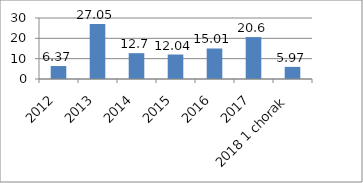
| Category | Series 0 |
|---|---|
| 2012 | 6.37 |
| 2013 | 27.05 |
| 2014 | 12.7 |
| 2015 | 12.04 |
| 2016 | 15.01 |
| 2017 | 20.6 |
| 2018 1 chorak | 5.97 |